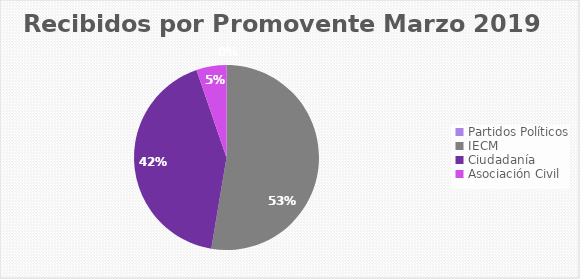
| Category | Recibidos por Promovente MARZO |
|---|---|
| Partidos Políticos | 0 |
| IECM | 20 |
| Ciudadanía  | 16 |
| Asociación Civil | 2 |